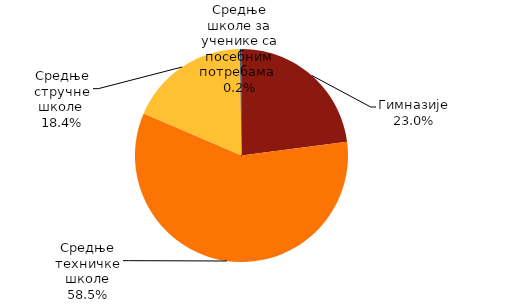
| Category | Series 0 |
|---|---|
| Гимназије | 11570 |
| Средње техничке школе | 29526 |
| Средње стручне школе  | 9248 |
| Средње школе за ученике са посебним потребама  | 108 |